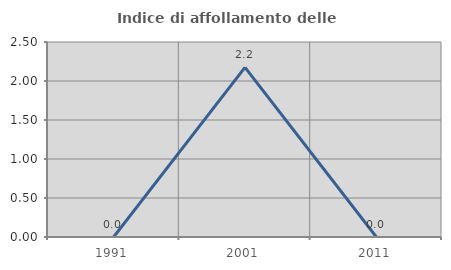
| Category | Indice di affollamento delle abitazioni  |
|---|---|
| 1991.0 | 0 |
| 2001.0 | 2.174 |
| 2011.0 | 0 |